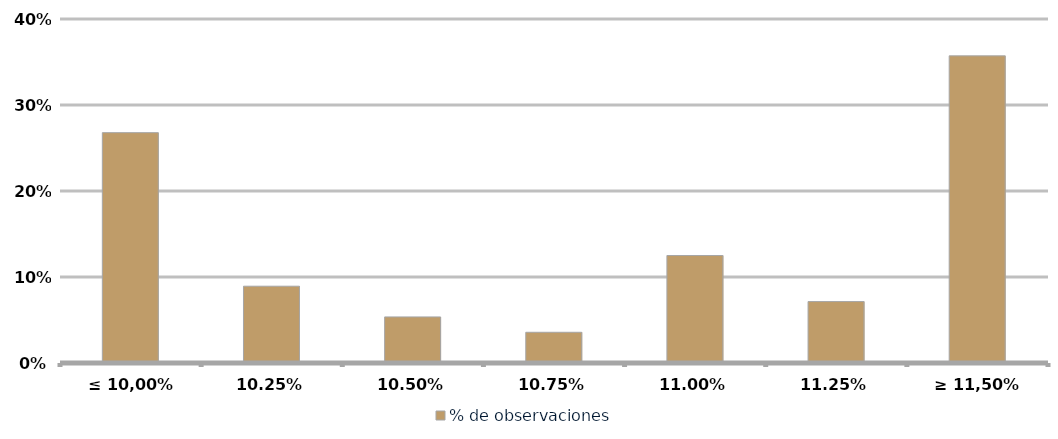
| Category | % de observaciones  |
|---|---|
| ≤ 10,00% | 0.268 |
| 10,25% | 0.089 |
| 10,50% | 0.054 |
| 10,75% | 0.036 |
| 11,00% | 0.125 |
| 11,25% | 0.071 |
| ≥ 11,50% | 0.357 |